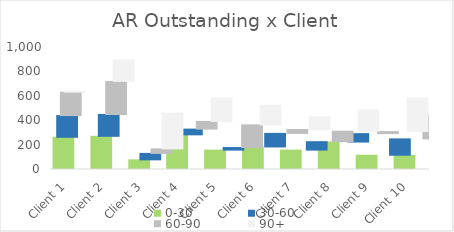
| Category | 0-30 | 30-60 | 60-90 | 90+ |
|---|---|---|---|---|
| Client 1 | 264 | 178 | 192 | 7 |
| Client 2 | 272 | 179 | 271 | 175 |
| Client 3 | 79 | 53 | 37 | 292 |
| Client 4 | 284 | 47 | 63 | 192 |
| Client 5 | 159 | 21 | 186 | 160 |
| Client 6 | 185 | 111 | 32 | 103 |
| Client 7 | 159 | 69 | 86 | 173 |
| Client 8 | 225 | 69 | 17 | 275 |
| Client 9 | 117 | 134 | 197 | 22 |
| Client 10 | 115 | 58 | 241 | 51 |